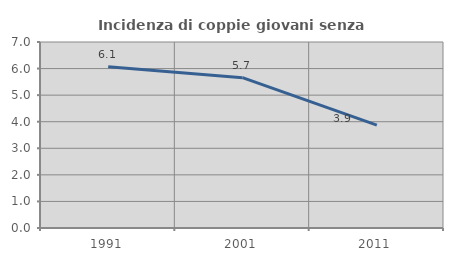
| Category | Incidenza di coppie giovani senza figli |
|---|---|
| 1991.0 | 6.071 |
| 2001.0 | 5.658 |
| 2011.0 | 3.872 |